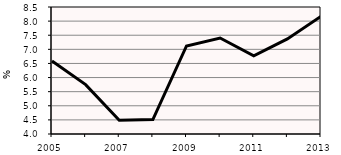
| Category | SHARE OF UNEMPLOYED PERSONS |
|---|---|
| 2005.0 | 6.59 |
| 2006.0 | 5.75 |
| 2007.0 | 4.49 |
| 2008.0 | 4.51 |
| 2009.0 | 7.12 |
| 2010.0 | 7.4 |
| 2011.0 | 6.77 |
| 2012.0 | 7.37 |
| 2013.0 | 8.17 |